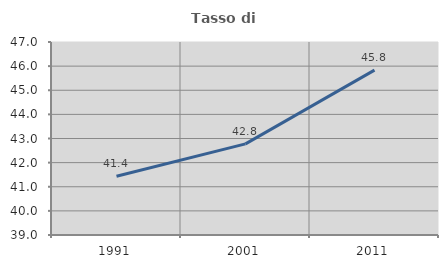
| Category | Tasso di occupazione   |
|---|---|
| 1991.0 | 41.436 |
| 2001.0 | 42.777 |
| 2011.0 | 45.833 |